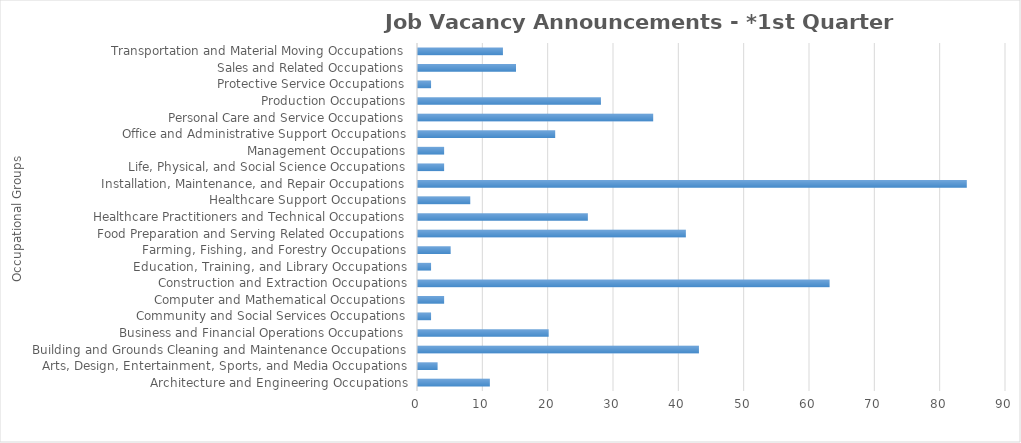
| Category | Total JVAs |
|---|---|
| Architecture and Engineering Occupations | 11 |
| Arts, Design, Entertainment, Sports, and Media Occupations | 3 |
| Building and Grounds Cleaning and Maintenance Occupations | 43 |
| Business and Financial Operations Occupations | 20 |
| Community and Social Services Occupations | 2 |
| Computer and Mathematical Occupations | 4 |
| Construction and Extraction Occupations | 63 |
| Education, Training, and Library Occupations | 2 |
| Farming, Fishing, and Forestry Occupations | 5 |
| Food Preparation and Serving Related Occupations | 41 |
| Healthcare Practitioners and Technical Occupations | 26 |
| Healthcare Support Occupations | 8 |
| Installation, Maintenance, and Repair Occupations | 84 |
| Life, Physical, and Social Science Occupations | 4 |
| Management Occupations | 4 |
| Office and Administrative Support Occupations | 21 |
| Personal Care and Service Occupations | 36 |
| Production Occupations | 28 |
| Protective Service Occupations | 2 |
| Sales and Related Occupations | 15 |
| Transportation and Material Moving Occupations | 13 |